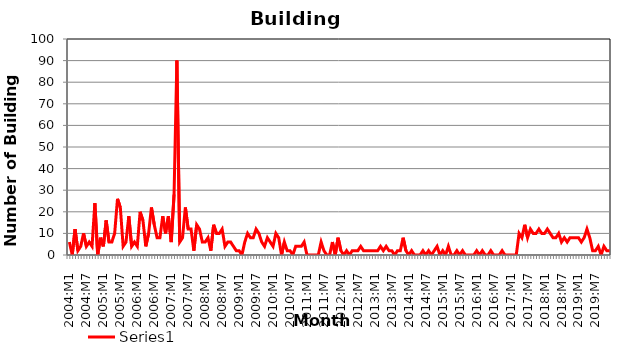
| Category | Series 0 |
|---|---|
| 2004:M1 | 6 |
| 2004:M2 | 0 |
| 2004:M3 | 12 |
| 2004:M4 | 2 |
| 2004:M5 | 4 |
| 2004:M6 | 10 |
| 2004:M7 | 4 |
| 2004:M8 | 6 |
| 2004:M9 | 4 |
| 2004:M10 | 24 |
| 2004:M11 | 0 |
| 2004:M12 | 8 |
| 2005:M1 | 4 |
| 2005:M2 | 16 |
| 2005:M3 | 6 |
| 2005:M4 | 6 |
| 2005:M5 | 10 |
| 2005:M6 | 26 |
| 2005:M7 | 22 |
| 2005:M8 | 4 |
| 2005:M9 | 6 |
| 2005:M10 | 18 |
| 2005:M11 | 4 |
| 2005:M12 | 6 |
| 2006:M1 | 4 |
| 2006:M2 | 20 |
| 2006:M3 | 16 |
| 2006:M4 | 4 |
| 2006:M5 | 10 |
| 2006:M6 | 22 |
| 2006:M7 | 14 |
| 2006:M8 | 8 |
| 2006:M9 | 8 |
| 2006:M10 | 18 |
| 2006:M11 | 10 |
| 2006:M12 | 18 |
| 2007:M1 | 6 |
| 2007:M2 | 28 |
| 2007:M3 | 90 |
| 2007:M4 | 6 |
| 2007:M5 | 8 |
| 2007:M6 | 22 |
| 2007:M7 | 12 |
| 2007:M8 | 12 |
| 2007:M9 | 2 |
| 2007:M10 | 14 |
| 2007:M11 | 12 |
| 2007:M12 | 6 |
| 2008:M1 | 6 |
| 2008:M2 | 8 |
| 2008:M3 | 2 |
| 2008:M4 | 14 |
| 2008:M5 | 10 |
| 2008:M6 | 10 |
| 2008:M7 | 12 |
| 2008:M8 | 4 |
| 2008:M9 | 6 |
| 2008:M10 | 6 |
| 2008:M11 | 4 |
| 2008:M12 | 2 |
| 2009:M1 | 2 |
| 2009:M2 | 0 |
| 2009:M3 | 6 |
| 2009:M4 | 10 |
| 2009:M5 | 8 |
| 2009:M6 | 8 |
| 2009:M7 | 12 |
| 2009:M8 | 10 |
| 2009:M9 | 6 |
| 2009:M10 | 4 |
| 2009:M11 | 8 |
| 2009:M12 | 6 |
| 2010:M1 | 4 |
| 2010:M2 | 10 |
| 2010:M3 | 8 |
| 2010:M4 | 0 |
| 2010:M5 | 6 |
| 2010:M6 | 2 |
| 2010:M7 | 2 |
| 2010:M8 | 0 |
| 2010:M9 | 4 |
| 2010:M10 | 4 |
| 2010:M11 | 4 |
| 2010:M12 | 6 |
| 2011:M1 | 0 |
| 2011:M2 | 0 |
| 2011:M3 | 0 |
| 2011:M4 | 0 |
| 2011:M5 | 0 |
| 2011:M6 | 6 |
| 2011:M7 | 2 |
| 2011:M8 | 0 |
| 2011:M9 | 0 |
| 2011:M10 | 6 |
| 2011:M11 | 0 |
| 2011:M12 | 8 |
| 2012:M1 | 2 |
| 2012:M2 | 0 |
| 2012:M3 | 2 |
| 2012:M4 | 0 |
| 2012:M5 | 2 |
| 2012:M6 | 2 |
| 2012:M7 | 2 |
| 2012:M8 | 4 |
| 2012:M9 | 2 |
| 2012:M10 | 2 |
| 2012:M11 | 2 |
| 2012:M12 | 2 |
| 2013:M1 | 2 |
| 2013:M2 | 2 |
| 2013:M3 | 4 |
| 2013:M4 | 2 |
| 2013:M5 | 4 |
| 2013:M6 | 2 |
| 2013:M7 | 2 |
| 2013:M8 | 0 |
| 2013:M9 | 2 |
| 2013:M10 | 2 |
| 2013:M11 | 8 |
| 2013:M12 | 2 |
| 2014:M1 | 0 |
| 2014:M2 | 2 |
| 2014:M3 | 0 |
| 2014:M4 | 0 |
| 2014:M5 | 0 |
| 2014:M6 | 2 |
| 2014:M7 | 0 |
| 2014:M8 | 2 |
| 2014:M9 | 0 |
| 2014:M10 | 2 |
| 2014:M11 | 4 |
| 2014:M12 | 0 |
| 2015:M1 | 2 |
| 2015:M2 | 0 |
| 2015:M3 | 4 |
| 2015:M4 | 0 |
| 2015:M5 | 0 |
| 2015:M6 | 2 |
| 2015:M7 | 0 |
| 2015:M8 | 2 |
| 2015:M9 | 0 |
| 2015:M10 | 0 |
| 2015:M11 | 0 |
| 2015:M12 | 0 |
| 2016:M1 | 2 |
| 2016:M2 | 0 |
| 2016:M3 | 2 |
| 2016:M4 | 0 |
| 2016:M5 | 0 |
| 2016:M6 | 2 |
| 2016:M7 | 0 |
| 2016:M8 | 0 |
| 2016:M9 | 0 |
| 2016:M10 | 2 |
| 2016:M11 | 0 |
| 2016:M12 | 0 |
| 2017:M1 | 0 |
| 2017:M2 | 0 |
| 2017:M3 | 0 |
| 2017:M4 | 10 |
| 2017:M5 | 8 |
| 2017:M6 | 14 |
| 2017:M7 | 8 |
| 2017:M8 | 12 |
| 2017:M9 | 10 |
| 2017:M10 | 10 |
| 2017:M11 | 12 |
| 2017:M12 | 10 |
| 2018:M1 | 10 |
| 2018:M2 | 12 |
| 2018:M3 | 10 |
| 2018:M4 | 8 |
| 2018:M5 | 8 |
| 2018:M6 | 10 |
| 2018:M7 | 6 |
| 2018:M8 | 8 |
| 2018:M9 | 6 |
| 2018:M10 | 8 |
| 2018:M11 | 8 |
| 2018:M12 | 8 |
| 2019:M1 | 8 |
| 2019:M2 | 6 |
| 2019:M3 | 8 |
| 2019:M4 | 12 |
| 2019:M5 | 8 |
| 2019:M6 | 2 |
| 2019:M7 | 2 |
| 2019:M8 | 4 |
| 2019:M9 | 0 |
| 2019:M10 | 4 |
| 2019:M11 | 2 |
| 2019:M12 | 2 |